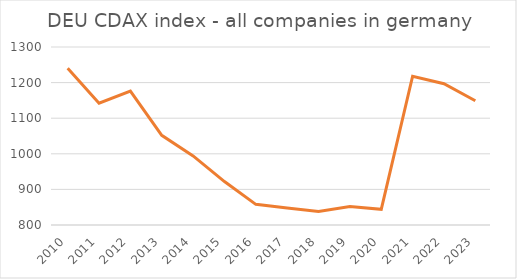
| Category | DEU CDAX index - all companies in germany |
|---|---|
| 2010.0 | 1240 |
| 2011.0 | 1142 |
| 2012.0 | 1176 |
| 2013.0 | 1052 |
| 2014.0 | 994 |
| 2015.0 | 922 |
| 2016.0 | 858 |
| 2017.0 | 848 |
| 2018.0 | 838 |
| 2019.0 | 852 |
| 2020.0 | 844 |
| 2021.0 | 1218 |
| 2022.0 | 1197 |
| 2023.0 | 1149 |